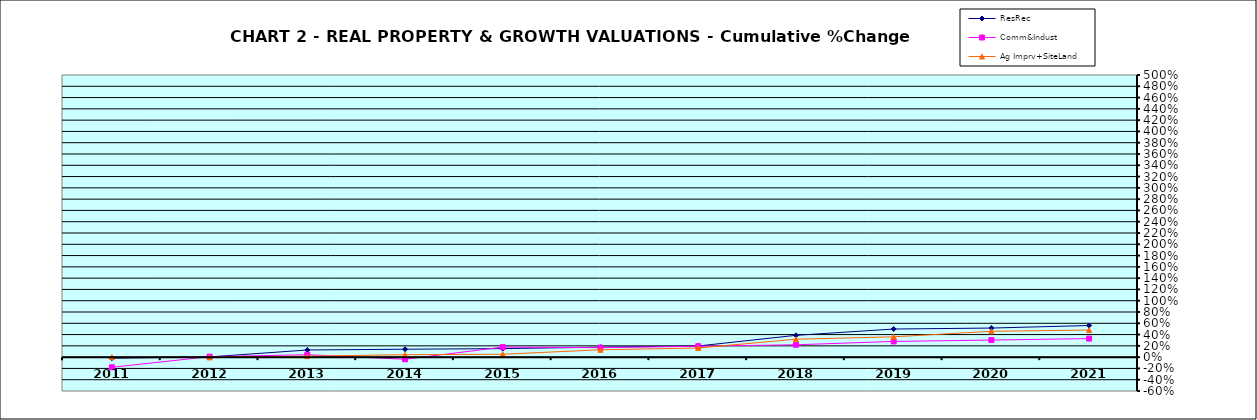
| Category | ResRec | Comm&Indust | Ag Imprv+SiteLand |
|---|---|---|---|
| 2011.0 | -0.019 | -0.18 | 0 |
| 2012.0 | 0.004 | 0.008 | -0.004 |
| 2013.0 | 0.127 | 0.043 | 0.018 |
| 2014.0 | 0.14 | -0.038 | 0.043 |
| 2015.0 | 0.151 | 0.178 | 0.051 |
| 2016.0 | 0.177 | 0.168 | 0.13 |
| 2017.0 | 0.198 | 0.194 | 0.162 |
| 2018.0 | 0.387 | 0.219 | 0.317 |
| 2019.0 | 0.498 | 0.278 | 0.361 |
| 2020.0 | 0.515 | 0.303 | 0.458 |
| 2021.0 | 0.561 | 0.329 | 0.48 |